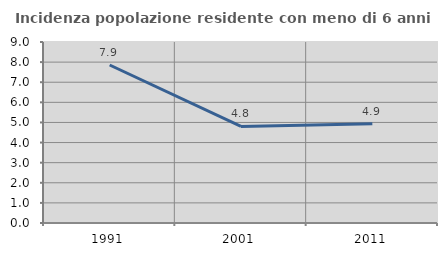
| Category | Incidenza popolazione residente con meno di 6 anni |
|---|---|
| 1991.0 | 7.857 |
| 2001.0 | 4.804 |
| 2011.0 | 4.934 |